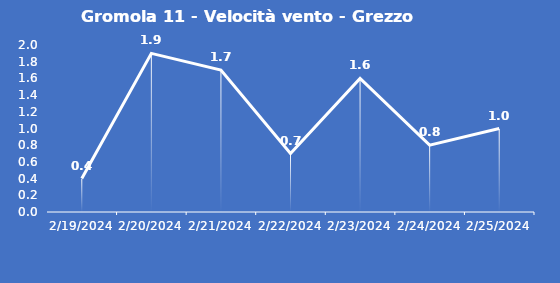
| Category | Gromola 11 - Velocità vento - Grezzo (m/s) |
|---|---|
| 2/19/24 | 0.4 |
| 2/20/24 | 1.9 |
| 2/21/24 | 1.7 |
| 2/22/24 | 0.7 |
| 2/23/24 | 1.6 |
| 2/24/24 | 0.8 |
| 2/25/24 | 1 |